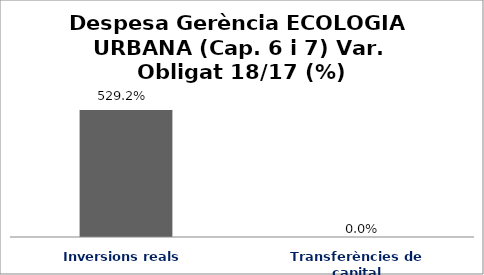
| Category | Series 0 |
|---|---|
| Inversions reals | 5.292 |
| Transferències de capital | 0 |